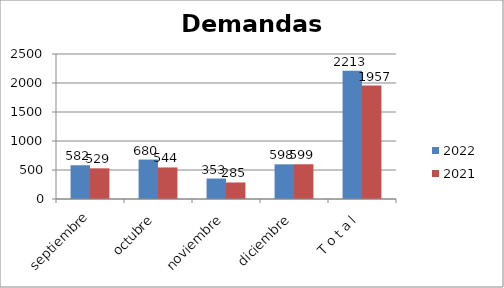
| Category | 2022 | 2021 |
|---|---|---|
| septiembre | 582 | 529 |
| octubre | 680 | 544 |
| noviembre | 353 | 285 |
| diciembre | 598 | 599 |
| T o t a l | 2213 | 1957 |